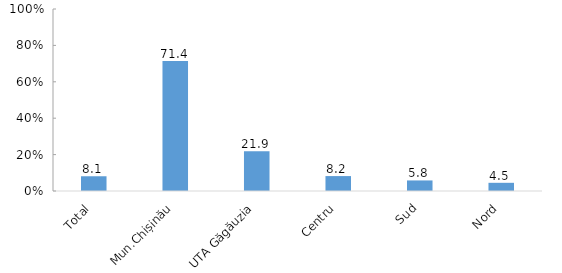
| Category | Series 0 |
|---|---|
| Total | 8.1 |
| Mun.Chișinău | 71.4 |
| UTA Găgăuzia | 21.9 |
| Centru | 8.2 |
| Sud | 5.8 |
| Nord | 4.5 |